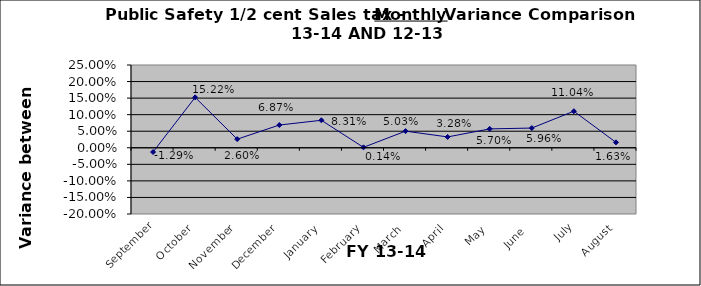
| Category | September October November December January February March April May June  July August |
|---|---|
| September | -0.013 |
| October | 0.152 |
| November | 0.026 |
| December | 0.069 |
| January | 0.083 |
| February | 0.001 |
| March | 0.05 |
| April | 0.033 |
| May | 0.057 |
| June  | 0.06 |
| July | 0.11 |
| August | 0.016 |